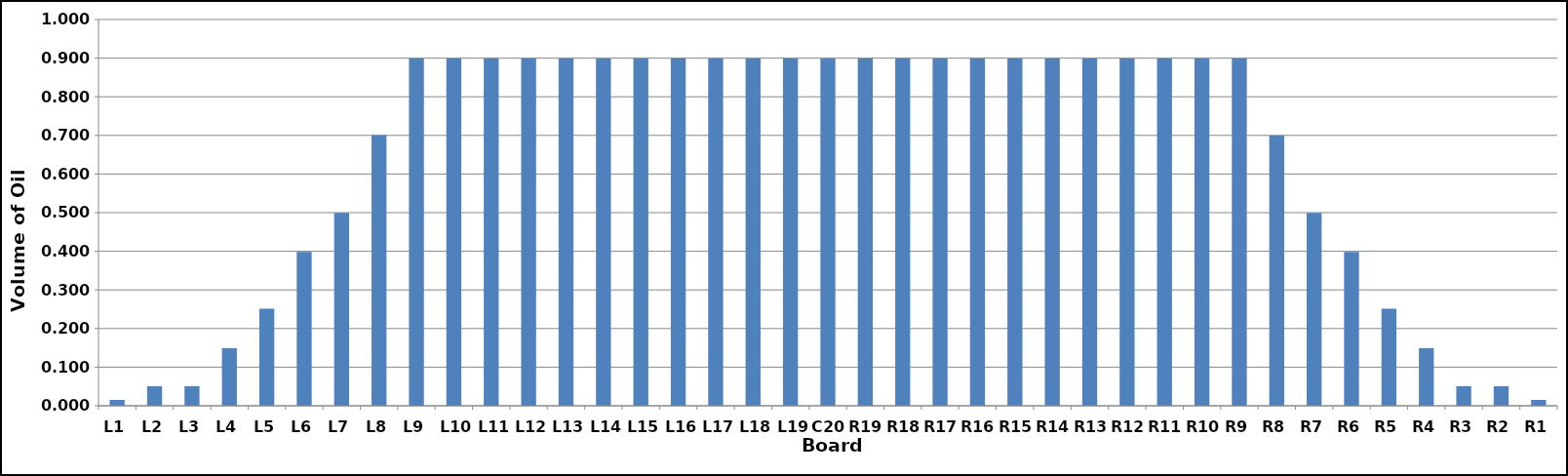
| Category | Series 0 |
|---|---|
| L1 | 0.015 |
| L2 | 0.051 |
| L3 | 0.051 |
| L4 | 0.149 |
| L5 | 0.251 |
| L6 | 0.399 |
| L7 | 0.499 |
| L8 | 0.701 |
| L9 | 0.899 |
| L10 | 0.899 |
| L11 | 0.899 |
| L12 | 0.899 |
| L13 | 0.899 |
| L14 | 0.899 |
| L15 | 0.899 |
| L16 | 0.899 |
| L17 | 0.899 |
| L18 | 0.899 |
| L19 | 0.899 |
| C20 | 0.899 |
| R19 | 0.899 |
| R18 | 0.899 |
| R17 | 0.899 |
| R16 | 0.899 |
| R15 | 0.899 |
| R14 | 0.899 |
| R13 | 0.899 |
| R12 | 0.899 |
| R11 | 0.899 |
| R10 | 0.899 |
| R9 | 0.899 |
| R8 | 0.7 |
| R7 | 0.499 |
| R6 | 0.399 |
| R5 | 0.251 |
| R4 | 0.149 |
| R3 | 0.051 |
| R2 | 0.051 |
| R1 | 0.015 |